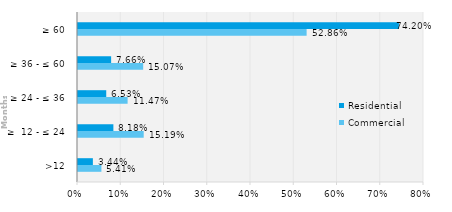
| Category | Commercial | Residential |
|---|---|---|
| >12 | 0.054 | 0.034 |
| ≥  12 - ≤ 24 | 0.152 | 0.082 |
| ≥ 24 - ≤ 36 | 0.115 | 0.065 |
| ≥ 36 - ≤ 60 | 0.151 | 0.077 |
| ≥ 60 | 0.529 | 0.742 |